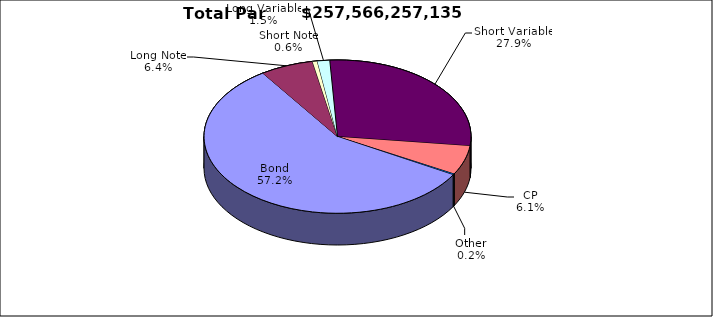
| Category | Par Value |
|---|---|
| Bond | 147362696779 |
| Long Note | 16588045923 |
| Short Note | 1510587819 |
| Long Variable | 3868946405 |
| Short Variable | 71809481817 |
| CP | 15830619000 |
| Other | 595879392 |